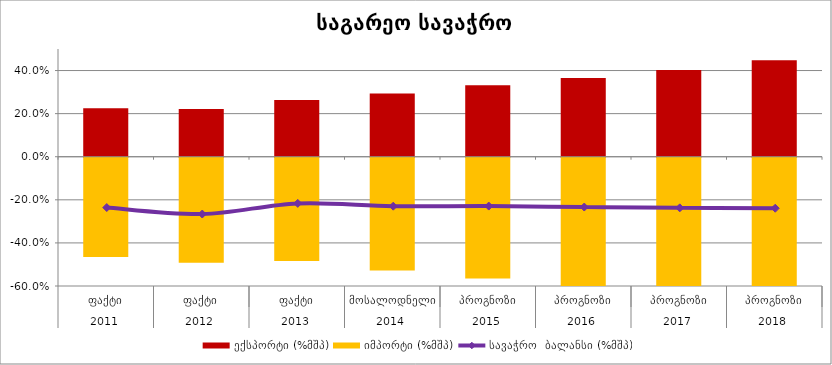
| Category | ექსპორტი (%მშპ) | იმპორტი (%მშპ) |
|---|---|---|
| 0 | 0.225 | -0.461 |
| 1 | 0.221 | -0.487 |
| 2 | 0.263 | -0.48 |
| 3 | 0.293 | -0.523 |
| 4 | 0.331 | -0.561 |
| 5 | 0.365 | -0.599 |
| 6 | 0.403 | -0.64 |
| 7 | 0.447 | -0.687 |